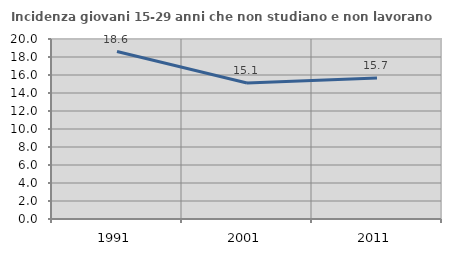
| Category | Incidenza giovani 15-29 anni che non studiano e non lavorano  |
|---|---|
| 1991.0 | 18.609 |
| 2001.0 | 15.107 |
| 2011.0 | 15.675 |